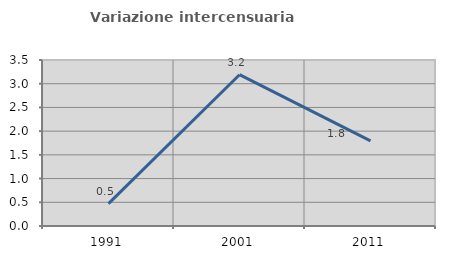
| Category | Variazione intercensuaria annua |
|---|---|
| 1991.0 | 0.472 |
| 2001.0 | 3.19 |
| 2011.0 | 1.795 |